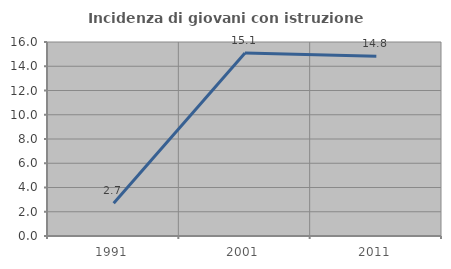
| Category | Incidenza di giovani con istruzione universitaria |
|---|---|
| 1991.0 | 2.703 |
| 2001.0 | 15.094 |
| 2011.0 | 14.815 |